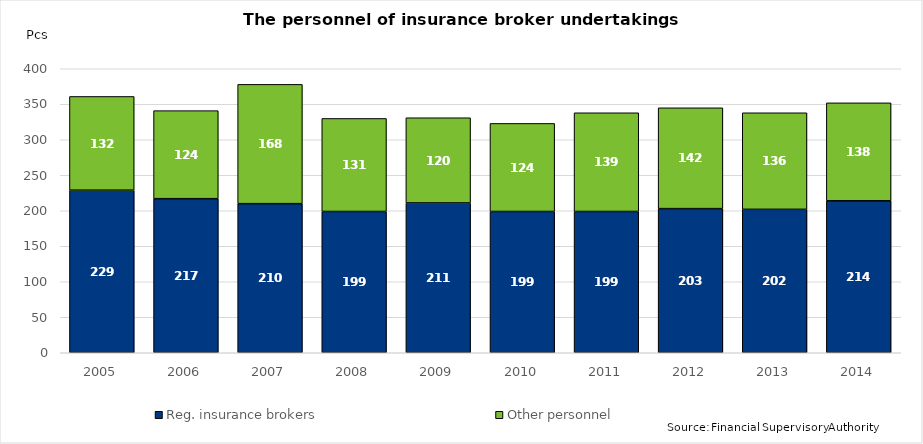
| Category | Reg. insurance brokers | Other personnel |
|---|---|---|
| 2005.0 | 229 | 132 |
| 2006.0 | 217 | 124 |
| 2007.0 | 210 | 168 |
| 2008.0 | 199 | 131 |
| 2009.0 | 211 | 120 |
| 2010.0 | 199 | 124 |
| 2011.0 | 199 | 139 |
| 2012.0 | 203 | 142 |
| 2013.0 | 202 | 136 |
| 2014.0 | 214 | 138 |